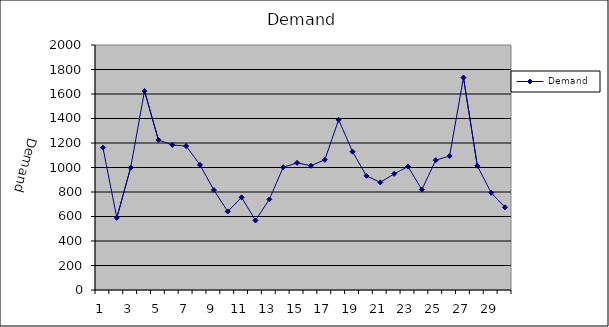
| Category | Demand |
|---|---|
| 0 | 1162.004 |
| 1 | 589.355 |
| 2 | 998.982 |
| 3 | 1624.94 |
| 4 | 1224.701 |
| 5 | 1184.38 |
| 6 | 1175.025 |
| 7 | 1021.534 |
| 8 | 815.748 |
| 9 | 641.314 |
| 10 | 756.149 |
| 11 | 567.674 |
| 12 | 740.274 |
| 13 | 1001.931 |
| 14 | 1037.835 |
| 15 | 1014.099 |
| 16 | 1063.255 |
| 17 | 1389.059 |
| 18 | 1129.331 |
| 19 | 931.808 |
| 20 | 878.609 |
| 21 | 948.437 |
| 22 | 1007.629 |
| 23 | 819.305 |
| 24 | 1059.865 |
| 25 | 1094.028 |
| 26 | 1734.164 |
| 27 | 1013.537 |
| 28 | 793.432 |
| 29 | 674.865 |